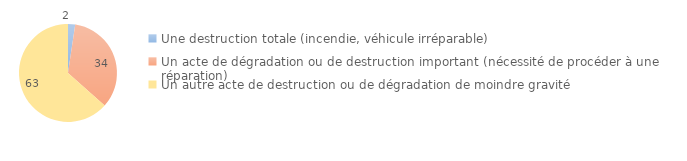
| Category | Series 0 |
|---|---|
| Une destruction totale (incendie, véhicule irréparable) | 2.366 |
| Un acte de dégradation ou de destruction important (nécessité de procéder à une réparation) | 34.2 |
| Un autre acte de destruction ou de dégradation de moindre gravité | 63.434 |